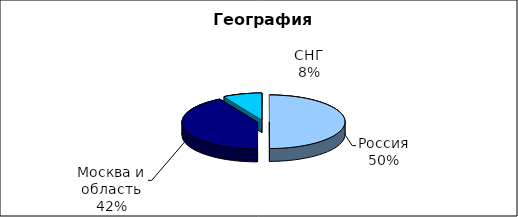
| Category | Series 0 |
|---|---|
| Россия | 600 |
| Москва и область | 500 |
| СНГ | 100 |